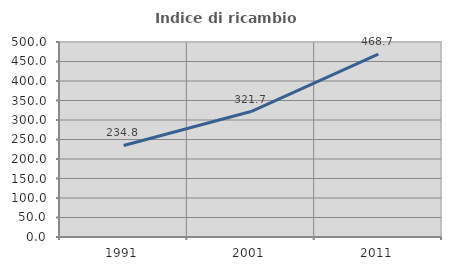
| Category | Indice di ricambio occupazionale  |
|---|---|
| 1991.0 | 234.76 |
| 2001.0 | 321.706 |
| 2011.0 | 468.651 |